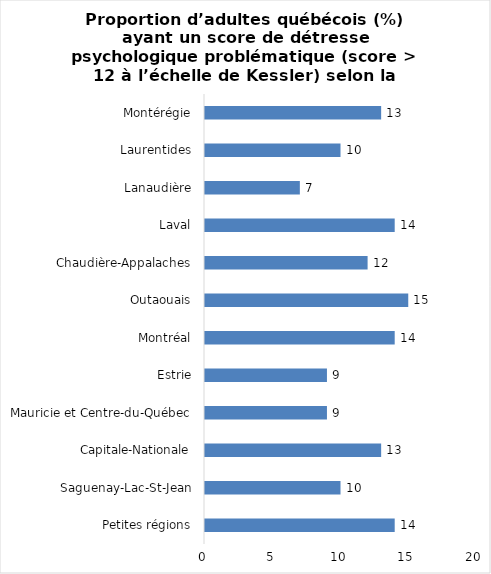
| Category | Series 0 |
|---|---|
| Petites régions | 14 |
| Saguenay-Lac-St-Jean | 10 |
| Capitale-Nationale | 13 |
| Mauricie et Centre-du-Québec | 9 |
| Estrie | 9 |
| Montréal | 14 |
| Outaouais | 15 |
| Chaudière-Appalaches | 12 |
| Laval | 14 |
| Lanaudière | 7 |
| Laurentides | 10 |
| Montérégie | 13 |